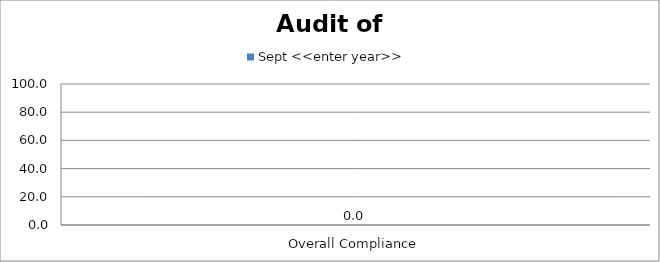
| Category | Sept <<enter year>> |
|---|---|
| Overall Compliance | 0 |